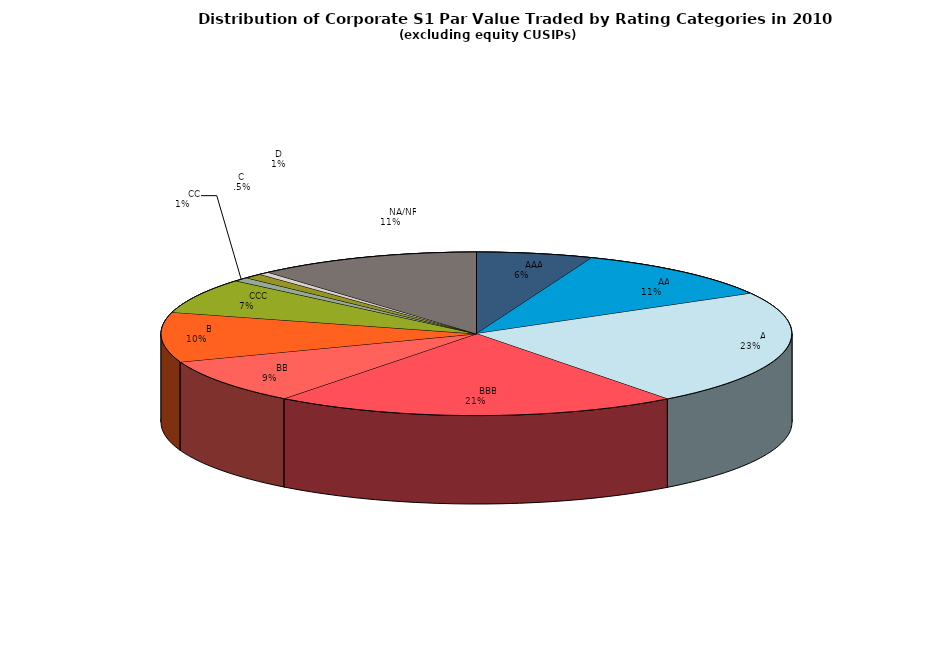
| Category | Series 0 |
|---|---|
|         AAA | 1324675.585 |
|         AA | 2405771.4 |
|         A | 5079936.704 |
|         BBB | 4614430.772 |
|         BB | 1994322.357 |
|         B | 2185476.708 |
|         CCC | 1543982.863 |
|         CC | 177098.334 |
|         C | 212297.527 |
|         D | 126493.191 |
|         NA/NR | 2548744.163 |